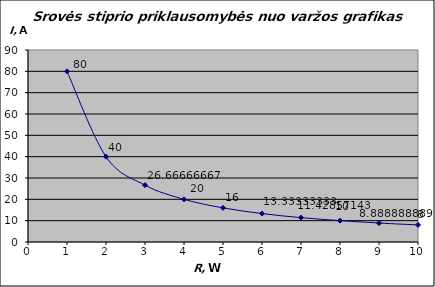
| Category | R (W) |
|---|---|
| 1.0 | 80 |
| 2.0 | 40 |
| 3.0 | 26.667 |
| 4.0 | 20 |
| 5.0 | 16 |
| 6.0 | 13.333 |
| 7.0 | 11.429 |
| 8.0 | 10 |
| 9.0 | 8.889 |
| 10.0 | 8 |